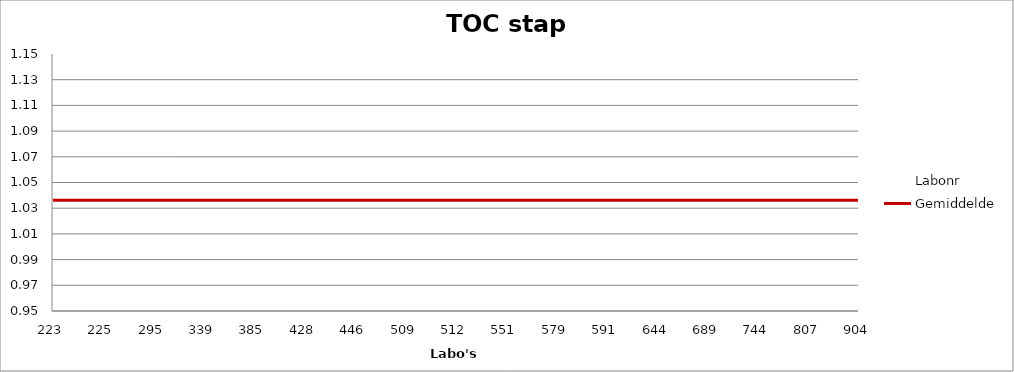
| Category | Labonr | Gemiddelde |
|---|---|---|
| 223.0 | 1.033 | 1.036 |
| 225.0 | 1.024 | 1.036 |
| 295.0 | 1.033 | 1.036 |
| 339.0 | 0.998 | 1.036 |
| 385.0 | 1.095 | 1.036 |
| 428.0 | 1.048 | 1.036 |
| 446.0 | 1.043 | 1.036 |
| 509.0 | 1.091 | 1.036 |
| 512.0 | 1.059 | 1.036 |
| 551.0 | 1.111 | 1.036 |
| 579.0 | 1.009 | 1.036 |
| 591.0 | 0.993 | 1.036 |
| 644.0 | 1.041 | 1.036 |
| 689.0 | 0.983 | 1.036 |
| 744.0 | 0.991 | 1.036 |
| 807.0 | 1.033 | 1.036 |
| 904.0 | 1.048 | 1.036 |